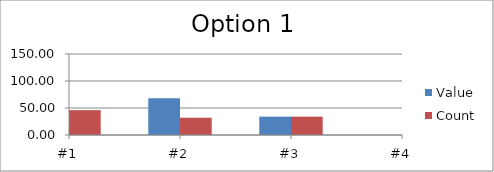
| Category | Value | Count |
|---|---|---|
| #1 | 100 | 46 |
| #2 | 68 | 32 |
| #3 | 34 | 34 |
| #4 | 0 | 46 |